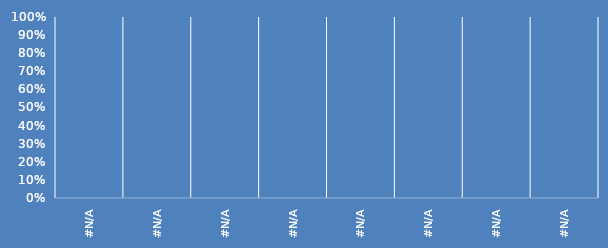
| Category | Series 0 |
|---|---|
| #N/A | 0 |
| #N/A | 0 |
| #N/A | 0 |
| #N/A | 0 |
| #N/A | 0 |
| #N/A | 0 |
| #N/A | 0 |
| #N/A | 0 |